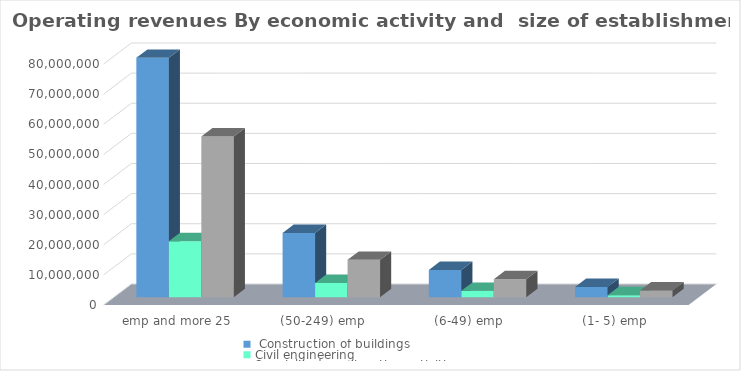
| Category |  Construction of buildings | Civil engineering | Specialized construction activities |
|---|---|---|---|
|  (1- 5) emp  | 3402624 | 675816 | 2265222 |
|  (6-49) emp  | 9041243 | 2120188 | 5984113 |
|  (50-249) emp  | 21325432 | 4753611 | 12399521 |
|  emp and more 25  | 79467887 | 18589183 | 53391583 |